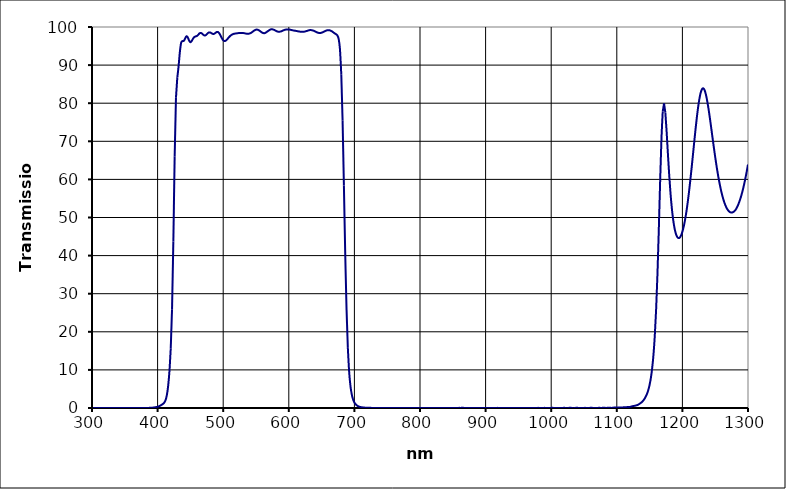
| Category | Series 0 |
|---|---|
| 300.0 | -0.001 |
| 302.0 | 0.001 |
| 304.0 | 0.003 |
| 306.0 | 0 |
| 308.0 | 0.001 |
| 310.0 | 0.002 |
| 312.0 | 0.001 |
| 314.0 | 0 |
| 316.0 | 0.005 |
| 318.0 | 0 |
| 320.0 | 0.001 |
| 322.0 | 0.001 |
| 324.0 | -0.002 |
| 326.0 | 0.001 |
| 328.0 | 0.001 |
| 330.0 | 0 |
| 332.0 | 0 |
| 334.0 | 0 |
| 336.0 | -0.001 |
| 338.0 | 0 |
| 340.0 | 0 |
| 342.0 | -0.002 |
| 344.0 | 0.002 |
| 346.0 | 0.001 |
| 348.0 | 0 |
| 350.0 | 0.001 |
| 352.0 | 0 |
| 354.0 | -0.001 |
| 356.0 | 0.001 |
| 358.0 | 0.001 |
| 360.0 | 0 |
| 362.0 | 0.003 |
| 364.0 | 0 |
| 366.0 | 0.001 |
| 368.0 | 0.002 |
| 370.0 | 0 |
| 372.0 | 0.002 |
| 374.0 | 0.003 |
| 376.0 | 0.001 |
| 378.0 | 0 |
| 380.0 | 0.001 |
| 382.0 | 0 |
| 384.0 | 0.007 |
| 386.0 | 0.023 |
| 388.0 | 0.042 |
| 390.0 | 0.063 |
| 392.0 | 0.088 |
| 394.0 | 0.126 |
| 396.0 | 0.184 |
| 398.0 | 0.25 |
| 400.0 | 0.323 |
| 402.0 | 0.438 |
| 404.0 | 0.61 |
| 406.0 | 0.821 |
| 408.0 | 1.053 |
| 410.0 | 1.379 |
| 412.0 | 2.01 |
| 414.0 | 3.291 |
| 416.0 | 5.667 |
| 418.0 | 9.523 |
| 420.0 | 15.536 |
| 422.0 | 25.941 |
| 424.0 | 43.727 |
| 426.0 | 65.968 |
| 428.0 | 81.421 |
| 430.0 | 86.676 |
| 432.0 | 89.717 |
| 434.0 | 93.541 |
| 436.0 | 95.939 |
| 438.0 | 96.293 |
| 440.0 | 96.357 |
| 442.0 | 97.015 |
| 444.0 | 97.588 |
| 446.0 | 97.274 |
| 448.0 | 96.442 |
| 450.0 | 96 |
| 452.0 | 96.315 |
| 454.0 | 96.937 |
| 456.0 | 97.369 |
| 458.0 | 97.528 |
| 460.0 | 97.654 |
| 462.0 | 97.974 |
| 464.0 | 98.349 |
| 466.0 | 98.451 |
| 468.0 | 98.238 |
| 470.0 | 97.917 |
| 472.0 | 97.766 |
| 474.0 | 97.924 |
| 476.0 | 98.282 |
| 478.0 | 98.556 |
| 480.0 | 98.564 |
| 482.0 | 98.385 |
| 484.0 | 98.196 |
| 486.0 | 98.203 |
| 488.0 | 98.416 |
| 490.0 | 98.667 |
| 492.0 | 98.685 |
| 494.0 | 98.347 |
| 496.0 | 97.744 |
| 498.0 | 97.065 |
| 500.0 | 96.519 |
| 502.0 | 96.313 |
| 504.0 | 96.413 |
| 506.0 | 96.745 |
| 508.0 | 97.169 |
| 510.0 | 97.547 |
| 512.0 | 97.844 |
| 514.0 | 98.06 |
| 516.0 | 98.194 |
| 518.0 | 98.27 |
| 520.0 | 98.319 |
| 522.0 | 98.367 |
| 524.0 | 98.415 |
| 526.0 | 98.434 |
| 528.0 | 98.439 |
| 530.0 | 98.425 |
| 532.0 | 98.37 |
| 534.0 | 98.298 |
| 536.0 | 98.238 |
| 538.0 | 98.226 |
| 540.0 | 98.288 |
| 542.0 | 98.427 |
| 544.0 | 98.646 |
| 546.0 | 98.916 |
| 548.0 | 99.142 |
| 550.0 | 99.291 |
| 552.0 | 99.306 |
| 554.0 | 99.167 |
| 556.0 | 98.94 |
| 558.0 | 98.683 |
| 560.0 | 98.476 |
| 562.0 | 98.377 |
| 564.0 | 98.436 |
| 566.0 | 98.65 |
| 568.0 | 98.906 |
| 570.0 | 99.141 |
| 572.0 | 99.335 |
| 574.0 | 99.426 |
| 576.0 | 99.347 |
| 578.0 | 99.216 |
| 580.0 | 99.026 |
| 582.0 | 98.846 |
| 584.0 | 98.768 |
| 586.0 | 98.772 |
| 588.0 | 98.839 |
| 590.0 | 98.968 |
| 592.0 | 99.138 |
| 594.0 | 99.261 |
| 596.0 | 99.335 |
| 598.0 | 99.369 |
| 600.0 | 99.345 |
| 602.0 | 99.281 |
| 604.0 | 99.208 |
| 606.0 | 99.129 |
| 608.0 | 99.062 |
| 610.0 | 99.007 |
| 612.0 | 98.94 |
| 614.0 | 98.871 |
| 616.0 | 98.812 |
| 618.0 | 98.748 |
| 620.0 | 98.729 |
| 622.0 | 98.751 |
| 624.0 | 98.786 |
| 626.0 | 98.888 |
| 628.0 | 98.991 |
| 630.0 | 99.098 |
| 632.0 | 99.184 |
| 634.0 | 99.187 |
| 636.0 | 99.112 |
| 638.0 | 99.015 |
| 640.0 | 98.86 |
| 642.0 | 98.674 |
| 644.0 | 98.527 |
| 646.0 | 98.44 |
| 648.0 | 98.431 |
| 650.0 | 98.51 |
| 652.0 | 98.636 |
| 654.0 | 98.813 |
| 656.0 | 98.986 |
| 658.0 | 99.112 |
| 660.0 | 99.174 |
| 662.0 | 99.147 |
| 664.0 | 99.025 |
| 666.0 | 98.831 |
| 668.0 | 98.574 |
| 670.0 | 98.325 |
| 672.0 | 98.107 |
| 674.0 | 97.784 |
| 676.0 | 96.882 |
| 678.0 | 94.137 |
| 680.0 | 87.575 |
| 682.0 | 75.404 |
| 684.0 | 58.425 |
| 686.0 | 40.602 |
| 688.0 | 25.973 |
| 690.0 | 15.78 |
| 692.0 | 9.485 |
| 694.0 | 5.741 |
| 696.0 | 3.537 |
| 698.0 | 2.236 |
| 700.0 | 1.443 |
| 702.0 | 0.958 |
| 704.0 | 0.652 |
| 706.0 | 0.451 |
| 708.0 | 0.32 |
| 710.0 | 0.231 |
| 712.0 | 0.166 |
| 714.0 | 0.125 |
| 716.0 | 0.095 |
| 718.0 | 0.072 |
| 720.0 | 0.057 |
| 722.0 | 0.046 |
| 724.0 | 0.036 |
| 726.0 | 0.031 |
| 728.0 | 0.026 |
| 730.0 | 0.02 |
| 732.0 | 0.02 |
| 734.0 | 0.015 |
| 736.0 | 0.013 |
| 738.0 | 0.011 |
| 740.0 | 0.009 |
| 742.0 | 0.007 |
| 744.0 | 0.008 |
| 746.0 | 0.006 |
| 748.0 | 0.004 |
| 750.0 | 0.007 |
| 752.0 | 0.004 |
| 754.0 | 0.005 |
| 756.0 | 0.004 |
| 758.0 | 0.004 |
| 760.0 | 0.002 |
| 762.0 | 0.004 |
| 764.0 | 0.003 |
| 766.0 | 0.002 |
| 768.0 | 0.005 |
| 770.0 | 0.002 |
| 772.0 | 0.002 |
| 774.0 | 0.003 |
| 776.0 | 0.002 |
| 778.0 | 0.001 |
| 780.0 | 0.004 |
| 782.0 | 0.003 |
| 784.0 | 0.002 |
| 786.0 | 0.005 |
| 788.0 | 0.001 |
| 790.0 | 0.002 |
| 792.0 | 0.003 |
| 794.0 | 0.002 |
| 796.0 | 0.002 |
| 798.0 | 0.006 |
| 800.0 | 0.002 |
| 802.0 | 0.003 |
| 804.0 | 0.006 |
| 806.0 | 0.004 |
| 808.0 | 0.004 |
| 810.0 | 0.007 |
| 812.0 | 0.004 |
| 814.0 | 0.005 |
| 816.0 | 0.006 |
| 818.0 | 0.005 |
| 820.0 | 0.007 |
| 822.0 | 0.009 |
| 824.0 | 0.006 |
| 826.0 | 0.01 |
| 828.0 | 0.01 |
| 830.0 | 0.007 |
| 832.0 | 0.011 |
| 834.0 | 0.012 |
| 836.0 | 0.011 |
| 838.0 | 0.013 |
| 840.0 | 0.016 |
| 842.0 | 0.013 |
| 844.0 | 0.017 |
| 846.0 | 0.017 |
| 848.0 | 0.016 |
| 850.0 | 0.017 |
| 852.0 | 0.018 |
| 854.0 | 0.019 |
| 856.0 | 0.023 |
| 858.0 | 0.027 |
| 860.0 | 0.035 |
| 862.0 | 0.028 |
| 864.0 | 0.048 |
| 866.0 | 0.037 |
| 868.0 | 0.026 |
| 870.0 | 0.02 |
| 872.0 | 0.019 |
| 874.0 | 0.002 |
| 876.0 | -0.011 |
| 878.0 | 0.008 |
| 880.0 | 0.027 |
| 882.0 | 0.004 |
| 884.0 | 0.026 |
| 886.0 | 0.007 |
| 888.0 | -0.008 |
| 890.0 | 0.008 |
| 892.0 | 0.011 |
| 894.0 | 0.014 |
| 896.0 | 0.009 |
| 898.0 | 0.006 |
| 900.0 | 0.015 |
| 902.0 | 0.014 |
| 904.0 | 0.01 |
| 906.0 | 0.01 |
| 908.0 | -0.022 |
| 910.0 | 0.008 |
| 912.0 | 0.021 |
| 914.0 | 0.003 |
| 916.0 | 0.005 |
| 918.0 | 0.035 |
| 920.0 | 0.012 |
| 922.0 | 0.012 |
| 924.0 | 0.012 |
| 926.0 | 0.008 |
| 928.0 | 0.001 |
| 930.0 | 0.007 |
| 932.0 | 0.017 |
| 934.0 | 0.026 |
| 936.0 | 0.025 |
| 938.0 | 0.02 |
| 940.0 | 0.01 |
| 942.0 | 0.028 |
| 944.0 | 0.007 |
| 946.0 | 0.011 |
| 948.0 | 0.005 |
| 950.0 | 0.006 |
| 952.0 | 0.029 |
| 954.0 | 0 |
| 956.0 | -0.001 |
| 958.0 | -0.005 |
| 960.0 | -0.003 |
| 962.0 | 0.013 |
| 964.0 | 0.018 |
| 966.0 | 0.025 |
| 968.0 | 0.024 |
| 970.0 | 0.006 |
| 972.0 | -0.003 |
| 974.0 | -0.009 |
| 976.0 | -0.002 |
| 978.0 | 0.002 |
| 980.0 | 0.038 |
| 982.0 | 0.009 |
| 984.0 | 0.005 |
| 986.0 | -0.01 |
| 988.0 | 0.011 |
| 990.0 | 0.036 |
| 992.0 | 0.006 |
| 994.0 | 0.008 |
| 996.0 | -0.002 |
| 998.0 | -0.019 |
| 1000.0 | 0.01 |
| 1002.0 | 0.047 |
| 1004.0 | 0.012 |
| 1006.0 | 0.007 |
| 1008.0 | -0.01 |
| 1010.0 | 0.003 |
| 1012.0 | 0.03 |
| 1014.0 | -0.002 |
| 1016.0 | -0.015 |
| 1018.0 | 0.02 |
| 1020.0 | 0.06 |
| 1022.0 | -0.009 |
| 1024.0 | -0.053 |
| 1026.0 | -0.002 |
| 1028.0 | 0.06 |
| 1030.0 | 0.062 |
| 1032.0 | -0.007 |
| 1034.0 | -0.048 |
| 1036.0 | -0.006 |
| 1038.0 | 0.049 |
| 1040.0 | 0.042 |
| 1042.0 | 0.009 |
| 1044.0 | 0.009 |
| 1046.0 | 0.01 |
| 1048.0 | -0.003 |
| 1050.0 | 0.026 |
| 1052.0 | 0.034 |
| 1054.0 | -0.003 |
| 1056.0 | -0.018 |
| 1058.0 | 0.006 |
| 1060.0 | 0.056 |
| 1062.0 | 0.044 |
| 1064.0 | 0.02 |
| 1066.0 | 0.021 |
| 1068.0 | 0.018 |
| 1070.0 | 0.004 |
| 1072.0 | 0.035 |
| 1074.0 | 0.045 |
| 1076.0 | 0.009 |
| 1078.0 | 0.044 |
| 1080.0 | 0.058 |
| 1082.0 | 0.039 |
| 1084.0 | 0.022 |
| 1086.0 | 0.059 |
| 1088.0 | 0.066 |
| 1090.0 | 0.045 |
| 1092.0 | 0.028 |
| 1094.0 | 0.058 |
| 1096.0 | 0.117 |
| 1098.0 | 0.108 |
| 1100.0 | 0.095 |
| 1102.0 | 0.104 |
| 1104.0 | 0.117 |
| 1106.0 | 0.138 |
| 1108.0 | 0.15 |
| 1110.0 | 0.167 |
| 1112.0 | 0.186 |
| 1114.0 | 0.212 |
| 1116.0 | 0.245 |
| 1118.0 | 0.274 |
| 1120.0 | 0.29 |
| 1122.0 | 0.37 |
| 1124.0 | 0.479 |
| 1126.0 | 0.537 |
| 1128.0 | 0.608 |
| 1130.0 | 0.711 |
| 1132.0 | 0.822 |
| 1134.0 | 1.024 |
| 1136.0 | 1.258 |
| 1138.0 | 1.525 |
| 1140.0 | 1.887 |
| 1142.0 | 2.344 |
| 1144.0 | 2.954 |
| 1146.0 | 3.697 |
| 1148.0 | 4.706 |
| 1150.0 | 6.087 |
| 1152.0 | 7.969 |
| 1154.0 | 10.578 |
| 1156.0 | 14.164 |
| 1158.0 | 19.239 |
| 1160.0 | 26.102 |
| 1162.0 | 35.245 |
| 1164.0 | 46.567 |
| 1166.0 | 59.041 |
| 1168.0 | 70.33 |
| 1170.0 | 77.765 |
| 1172.0 | 79.932 |
| 1174.0 | 77.519 |
| 1176.0 | 72.41 |
| 1178.0 | 66.442 |
| 1180.0 | 60.846 |
| 1182.0 | 56.061 |
| 1184.0 | 52.264 |
| 1186.0 | 49.339 |
| 1188.0 | 47.198 |
| 1190.0 | 45.763 |
| 1192.0 | 44.913 |
| 1194.0 | 44.596 |
| 1196.0 | 44.724 |
| 1198.0 | 45.299 |
| 1200.0 | 46.278 |
| 1202.0 | 47.613 |
| 1204.0 | 49.346 |
| 1206.0 | 51.413 |
| 1208.0 | 53.855 |
| 1210.0 | 56.619 |
| 1212.0 | 59.67 |
| 1214.0 | 62.924 |
| 1216.0 | 66.315 |
| 1218.0 | 69.754 |
| 1220.0 | 73.121 |
| 1222.0 | 76.241 |
| 1224.0 | 78.996 |
| 1226.0 | 81.232 |
| 1228.0 | 82.837 |
| 1230.0 | 83.726 |
| 1232.0 | 83.88 |
| 1234.0 | 83.341 |
| 1236.0 | 82.152 |
| 1238.0 | 80.419 |
| 1240.0 | 78.32 |
| 1242.0 | 75.952 |
| 1244.0 | 73.44 |
| 1246.0 | 70.851 |
| 1248.0 | 68.311 |
| 1250.0 | 65.862 |
| 1252.0 | 63.57 |
| 1254.0 | 61.448 |
| 1256.0 | 59.537 |
| 1258.0 | 57.822 |
| 1260.0 | 56.323 |
| 1262.0 | 55.019 |
| 1264.0 | 53.918 |
| 1266.0 | 53.024 |
| 1268.0 | 52.319 |
| 1270.0 | 51.799 |
| 1272.0 | 51.476 |
| 1274.0 | 51.31 |
| 1276.0 | 51.323 |
| 1278.0 | 51.489 |
| 1280.0 | 51.783 |
| 1282.0 | 52.277 |
| 1284.0 | 52.94 |
| 1286.0 | 53.778 |
| 1288.0 | 54.753 |
| 1290.0 | 55.879 |
| 1292.0 | 57.189 |
| 1294.0 | 58.644 |
| 1296.0 | 60.268 |
| 1298.0 | 62.018 |
| 1300.0 | 63.913 |